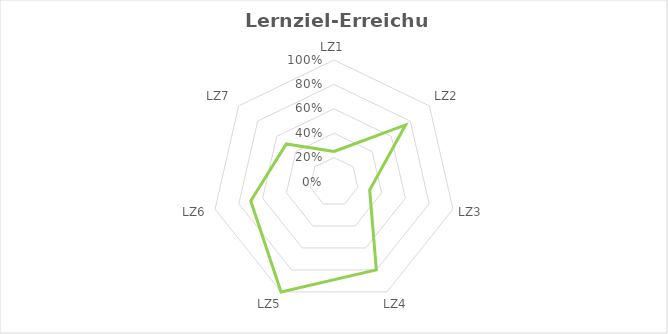
| Category | Erreichung |
|---|---|
| LZ1 | 0.25 |
| LZ2 | 0.75 |
| LZ3 | 0.3 |
| LZ4 | 0.8 |
| LZ5 | 1 |
| LZ6 | 0.7 |
| LZ7 | 0.5 |